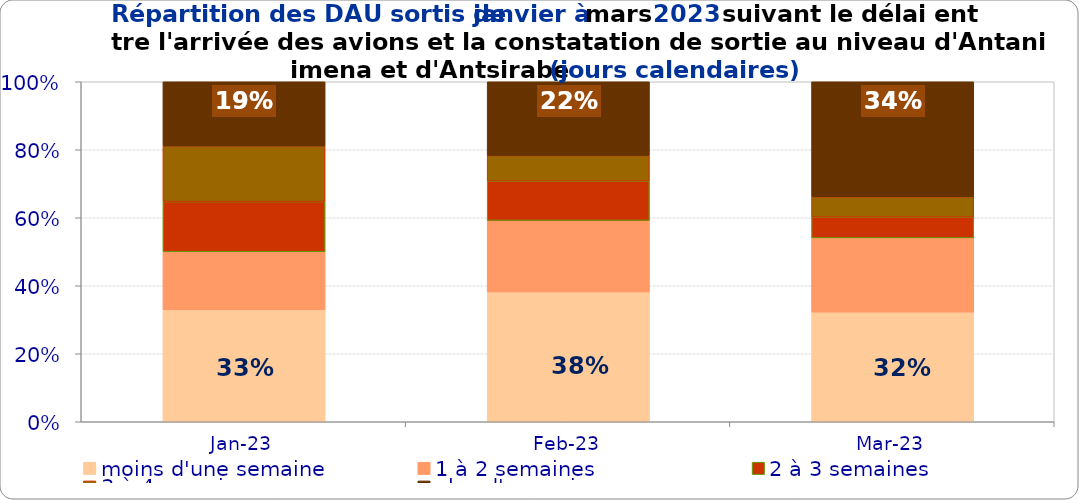
| Category | moins d'une semaine | 1 à 2 semaines | 2 à 3 semaines | 3 à 4 semaines | plus d'un mois |
|---|---|---|---|---|---|
| 2023-01-01 | 0.329 | 0.171 | 0.148 | 0.164 | 0.189 |
| 2023-02-01 | 0.382 | 0.21 | 0.116 | 0.075 | 0.217 |
| 2023-03-01 | 0.322 | 0.218 | 0.061 | 0.06 | 0.338 |